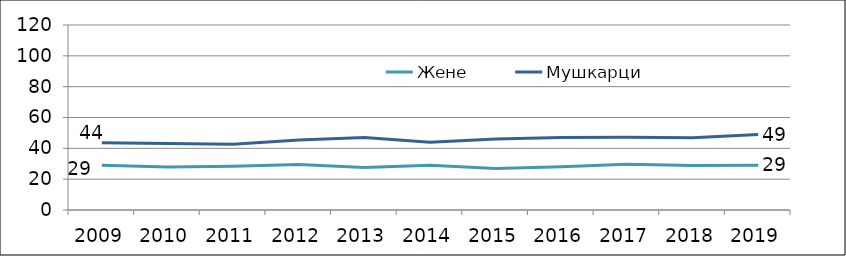
| Category | Жене | Мушкарци |
|---|---|---|
| 2009.0 | 29.09 | 43.679 |
| 2010.0 | 27.823 | 43.171 |
| 2011.0 | 28.345 | 42.638 |
| 2012.0 | 29.512 | 45.383 |
| 2013.0 | 27.587 | 47.069 |
| 2014.0 | 29 | 44 |
| 2015.0 | 27 | 46 |
| 2016.0 | 28 | 47 |
| 2017.0 | 29.714 | 47.166 |
| 2018.0 | 28.82 | 46.918 |
| 2019.0 | 29.061 | 48.94 |